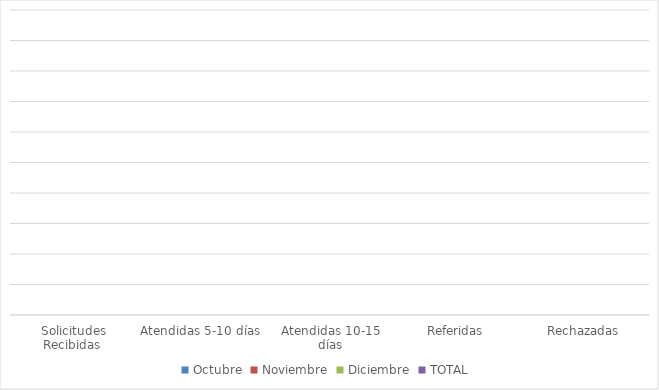
| Category | Octubre | Noviembre | Diciembre | TOTAL  |
|---|---|---|---|---|
| Solicitudes Recibidas  | 0 | 0 | 0 | 0 |
| Atendidas 5-10 días | 0 | 0 | 0 | 0 |
| Atendidas 10-15 días | 0 | 0 | 0 | 0 |
| Referidas | 0 | 0 | 0 | 0 |
| Rechazadas | 0 | 0 | 0 | 0 |